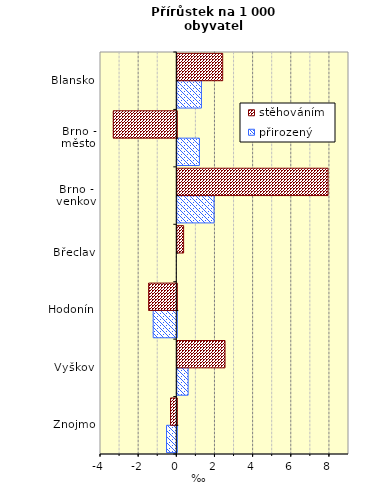
| Category | přirozený | stěhováním |
|---|---|---|
| Znojmo | -0.539 | -0.327 |
| Vyškov | 0.567 | 2.501 |
| Hodonín | -1.238 | -1.475 |
| Břeclav | 0 | 0.331 |
| Brno - venkov | 1.925 | 7.9 |
| Brno - město | 1.158 | -3.33 |
| Blansko | 1.264 | 2.379 |